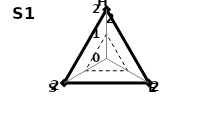
| Category | Hexano |
|---|---|
| H | 2 |
| E | 2 |
| S | 2 |